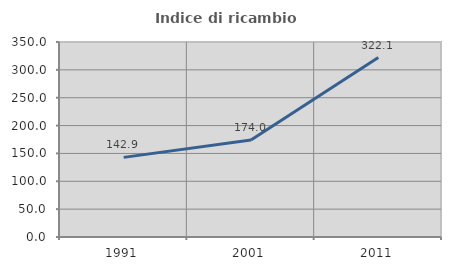
| Category | Indice di ricambio occupazionale  |
|---|---|
| 1991.0 | 142.92 |
| 2001.0 | 174.033 |
| 2011.0 | 322.124 |